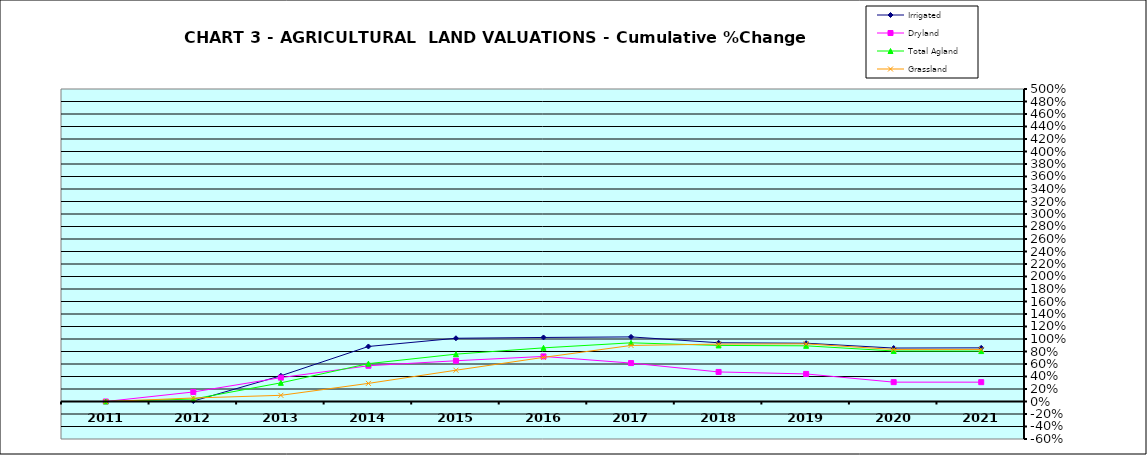
| Category | Irrigated | Dryland | Total Agland | Grassland |
|---|---|---|---|---|
| 2011.0 | 0 | 0 | 0 | 0 |
| 2012.0 | 0.007 | 0.152 | 0.04 | 0.056 |
| 2013.0 | 0.411 | 0.382 | 0.298 | 0.099 |
| 2014.0 | 0.88 | 0.572 | 0.606 | 0.29 |
| 2015.0 | 1.012 | 0.652 | 0.758 | 0.5 |
| 2016.0 | 1.025 | 0.721 | 0.858 | 0.706 |
| 2017.0 | 1.034 | 0.615 | 0.939 | 0.897 |
| 2018.0 | 0.94 | 0.473 | 0.897 | 0.918 |
| 2019.0 | 0.933 | 0.441 | 0.891 | 0.922 |
| 2020.0 | 0.855 | 0.31 | 0.808 | 0.833 |
| 2021.0 | 0.858 | 0.309 | 0.807 | 0.833 |